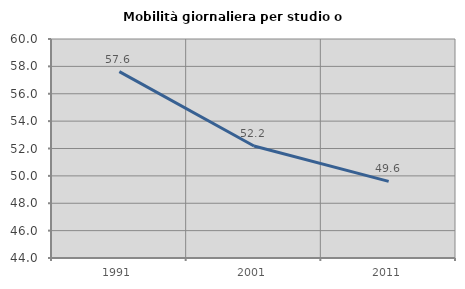
| Category | Mobilità giornaliera per studio o lavoro |
|---|---|
| 1991.0 | 57.62 |
| 2001.0 | 52.18 |
| 2011.0 | 49.598 |